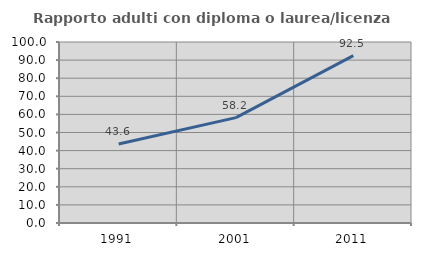
| Category | Rapporto adulti con diploma o laurea/licenza media  |
|---|---|
| 1991.0 | 43.636 |
| 2001.0 | 58.203 |
| 2011.0 | 92.46 |